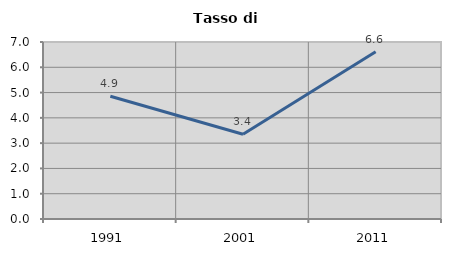
| Category | Tasso di disoccupazione   |
|---|---|
| 1991.0 | 4.855 |
| 2001.0 | 3.351 |
| 2011.0 | 6.612 |